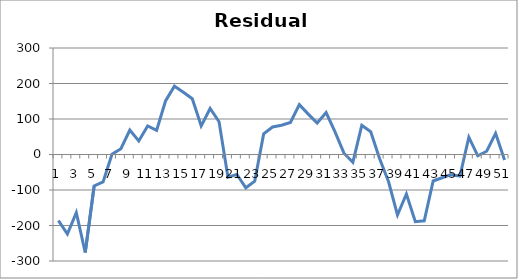
| Category | Series 0 |
|---|---|
| 0 | -186.101 |
| 1 | -223.943 |
| 2 | -163.744 |
| 3 | -275.886 |
| 4 | -88.707 |
| 5 | -77.068 |
| 6 | 0.48 |
| 7 | 16.189 |
| 8 | 68.857 |
| 9 | 38.186 |
| 10 | 80.335 |
| 11 | 68.043 |
| 12 | 150.782 |
| 13 | 192.42 |
| 14 | 175.529 |
| 15 | 157.238 |
| 16 | 80.346 |
| 17 | 129.535 |
| 18 | 92.273 |
| 19 | -64.088 |
| 20 | -56.159 |
| 21 | -93.791 |
| 22 | -75.052 |
| 23 | 58.136 |
| 24 | 77.395 |
| 25 | 82.514 |
| 26 | 90.062 |
| 27 | 140.441 |
| 28 | 113.849 |
| 29 | 88.888 |
| 30 | 118.067 |
| 31 | 63.925 |
| 32 | 3.704 |
| 33 | -21.998 |
| 34 | 82.081 |
| 35 | 64.23 |
| 36 | -11.992 |
| 37 | -76.803 |
| 38 | -170.435 |
| 39 | -111.096 |
| 40 | -189.097 |
| 41 | -186.949 |
| 42 | -74.65 |
| 43 | -65.462 |
| 44 | -56.793 |
| 45 | -60.864 |
| 46 | 48.764 |
| 47 | -3.607 |
| 48 | 9.211 |
| 49 | 59.65 |
| 50 | -15.451 |